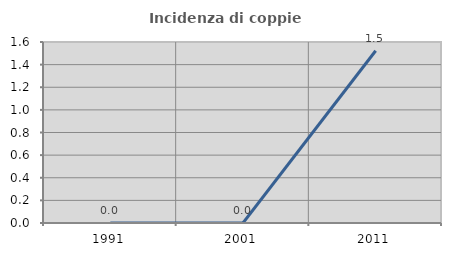
| Category | Incidenza di coppie miste |
|---|---|
| 1991.0 | 0 |
| 2001.0 | 0 |
| 2011.0 | 1.523 |